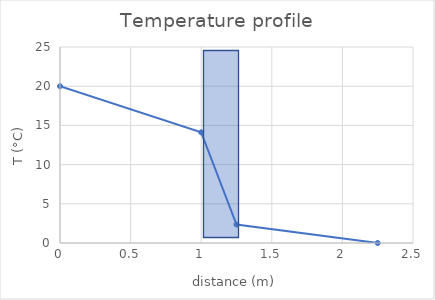
| Category | Series 0 |
|---|---|
| 0.0 | 20 |
| 1.0 | 14.118 |
| 1.25 | 2.353 |
| 2.25 | 0 |